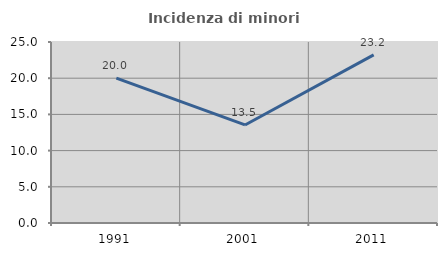
| Category | Incidenza di minori stranieri |
|---|---|
| 1991.0 | 20 |
| 2001.0 | 13.542 |
| 2011.0 | 23.214 |